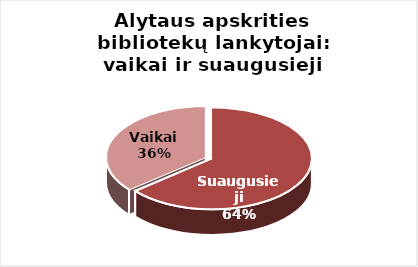
| Category | Series 0 |
|---|---|
| Suaugusieji | 442987 |
| Vaikai | 249454 |